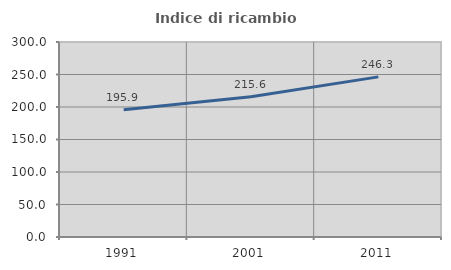
| Category | Indice di ricambio occupazionale  |
|---|---|
| 1991.0 | 195.906 |
| 2001.0 | 215.635 |
| 2011.0 | 246.341 |